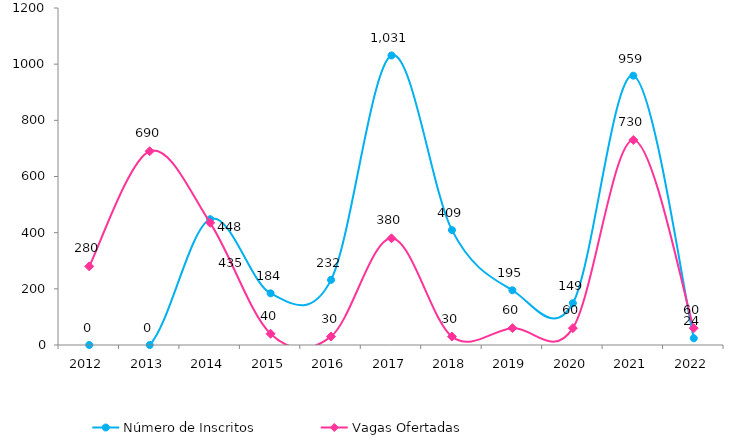
| Category | Número de Inscritos |
|---|---|
| 2012.0 | 0 |
| 2013.0 | 0 |
| 2014.0 | 448 |
| 2015.0 | 184 |
| 2016.0 | 232 |
| 2017.0 | 1031 |
| 2018.0 | 409 |
| 2019.0 | 195 |
| 2020.0 | 149 |
| 2021.0 | 959 |
| 2022.0 | 24 |